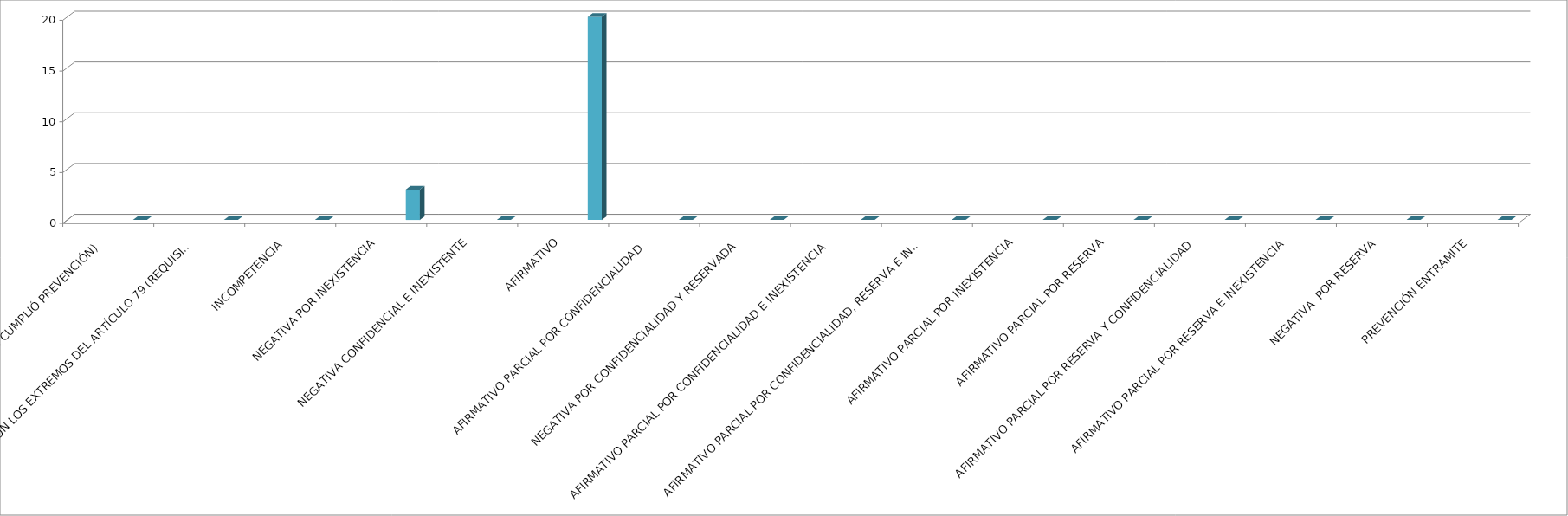
| Category | Series 0 | Series 1 | Series 2 | Series 3 | Series 4 |
|---|---|---|---|---|---|
| SE TIENE POR NO PRESENTADA ( NO CUMPLIÓ PREVENCIÓN) |  |  |  |  | 0 |
| NO CUMPLIO CON LOS EXTREMOS DEL ARTÍCULO 79 (REQUISITOS) |  |  |  |  | 0 |
| INCOMPETENCIA  |  |  |  |  | 0 |
| NEGATIVA POR INEXISTENCIA |  |  |  |  | 3 |
| NEGATIVA CONFIDENCIAL E INEXISTENTE |  |  |  |  | 0 |
| AFIRMATIVO |  |  |  |  | 20 |
| AFIRMATIVO PARCIAL POR CONFIDENCIALIDAD  |  |  |  |  | 0 |
| NEGATIVA POR CONFIDENCIALIDAD Y RESERVADA |  |  |  |  | 0 |
| AFIRMATIVO PARCIAL POR CONFIDENCIALIDAD E INEXISTENCIA |  |  |  |  | 0 |
| AFIRMATIVO PARCIAL POR CONFIDENCIALIDAD, RESERVA E INEXISTENCIA |  |  |  |  | 0 |
| AFIRMATIVO PARCIAL POR INEXISTENCIA |  |  |  |  | 0 |
| AFIRMATIVO PARCIAL POR RESERVA |  |  |  |  | 0 |
| AFIRMATIVO PARCIAL POR RESERVA Y CONFIDENCIALIDAD |  |  |  |  | 0 |
| AFIRMATIVO PARCIAL POR RESERVA E INEXISTENCIA |  |  |  |  | 0 |
| NEGATIVA  POR RESERVA |  |  |  |  | 0 |
| PREVENCIÓN ENTRAMITE |  |  |  |  | 0 |